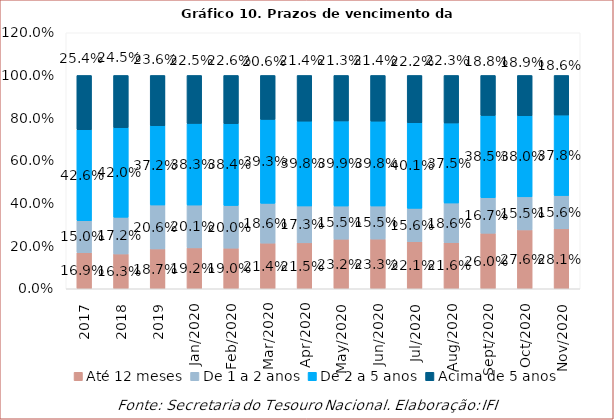
| Category | Até 12 meses | De 1 a 2 anos | De 2 a 5 anos | Acima de 5 anos |
|---|---|---|---|---|
| 2017.0 | 0.169 | 0.15 | 0.426 | 0.254 |
| 2018.0 | 0.163 | 0.172 | 0.42 | 0.245 |
| 2019.0 | 0.187 | 0.206 | 0.372 | 0.236 |
| 43831.0 | 0.192 | 0.201 | 0.383 | 0.225 |
| 43862.0 | 0.19 | 0.2 | 0.384 | 0.226 |
| 43891.0 | 0.214 | 0.186 | 0.393 | 0.206 |
| 43922.0 | 0.215 | 0.173 | 0.398 | 0.214 |
| 43952.0 | 0.232 | 0.155 | 0.399 | 0.213 |
| 43983.0 | 0.233 | 0.155 | 0.398 | 0.214 |
| 44013.0 | 0.221 | 0.156 | 0.401 | 0.222 |
| 44044.0 | 0.216 | 0.186 | 0.375 | 0.223 |
| 44075.0 | 0.26 | 0.167 | 0.385 | 0.188 |
| 44105.0 | 0.276 | 0.155 | 0.38 | 0.189 |
| 44136.0 | 0.281 | 0.156 | 0.378 | 0.186 |